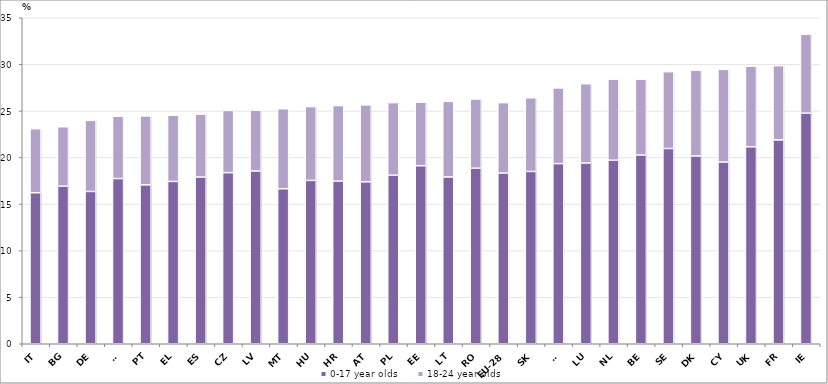
| Category | 0-17 year olds | 18-24 year olds |
|---|---|---|
| IT | 16.213 | 6.875 |
| BG | 16.918 | 6.381 |
| DE | 16.352 | 7.63 |
| SI | 17.733 | 6.69 |
| PT | 17.058 | 7.401 |
| EL | 17.429 | 7.11 |
| ES | 17.9 | 6.755 |
| CZ | 18.368 | 6.684 |
| LV | 18.547 | 6.532 |
| MT | 16.641 | 8.592 |
| HU | 17.54 | 7.924 |
| HR | 17.46 | 8.115 |
| AT | 17.383 | 8.266 |
| PL | 18.101 | 7.789 |
| EE | 19.112 | 6.813 |
| LT | 17.908 | 8.114 |
| RO | 18.847 | 7.431 |
| EU-28 | 18.321 | 7.561 |
| SK | 18.5 | 7.909 |
| FI | 19.34 | 8.126 |
| LU | 19.403 | 8.516 |
| NL | 19.708 | 8.692 |
| BE | 20.259 | 8.144 |
| SE | 20.964 | 8.249 |
| DK | 20.16 | 9.213 |
| CY | 19.506 | 9.958 |
| UK | 21.149 | 8.644 |
| FR | 21.888 | 7.97 |
| IE | 24.757 | 8.468 |